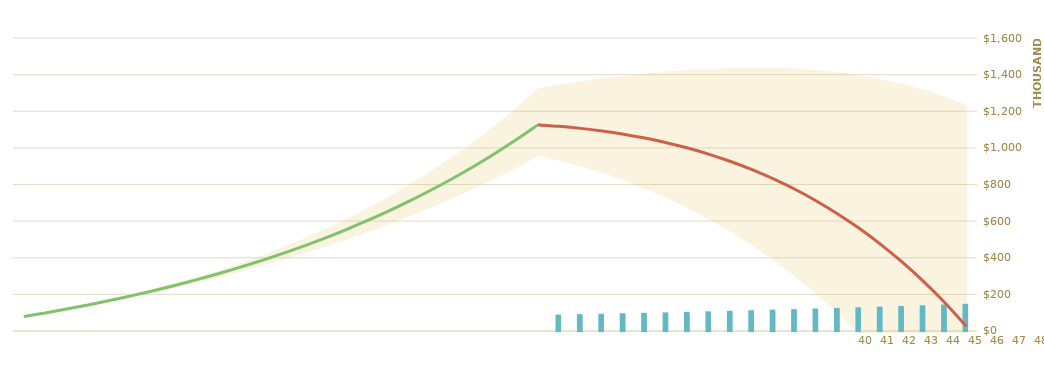
| Category | Retirement Income |
|---|---|
| 0 | 0 |
| 1 | 0 |
| 2 | 0 |
| 3 | 0 |
| 4 | 0 |
| 5 | 0 |
| 6 | 0 |
| 7 | 0 |
| 8 | 0 |
| 9 | 0 |
| 10 | 0 |
| 11 | 0 |
| 12 | 0 |
| 13 | 0 |
| 14 | 0 |
| 15 | 0 |
| 16 | 0 |
| 17 | 0 |
| 18 | 0 |
| 19 | 0 |
| 20 | 0 |
| 21 | 0 |
| 22 | 0 |
| 23 | 0 |
| 24 | 0 |
| 25 | 78516.672 |
| 26 | 80872.173 |
| 27 | 83298.338 |
| 28 | 85797.288 |
| 29 | 88371.206 |
| 30 | 91022.343 |
| 31 | 93753.013 |
| 32 | 96565.603 |
| 33 | 99462.571 |
| 34 | 102446.449 |
| 35 | 105519.842 |
| 36 | 108685.437 |
| 37 | 111946 |
| 38 | 115304.38 |
| 39 | 118763.512 |
| 40 | 122326.417 |
| 41 | 125996.21 |
| 42 | 129776.096 |
| 43 | 133669.379 |
| 44 | 137679.46 |